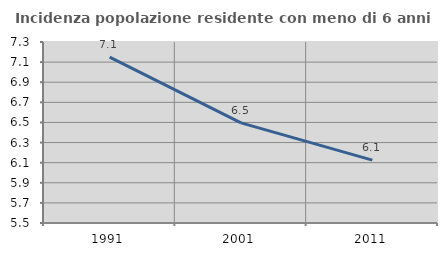
| Category | Incidenza popolazione residente con meno di 6 anni |
|---|---|
| 1991.0 | 7.149 |
| 2001.0 | 6.495 |
| 2011.0 | 6.125 |